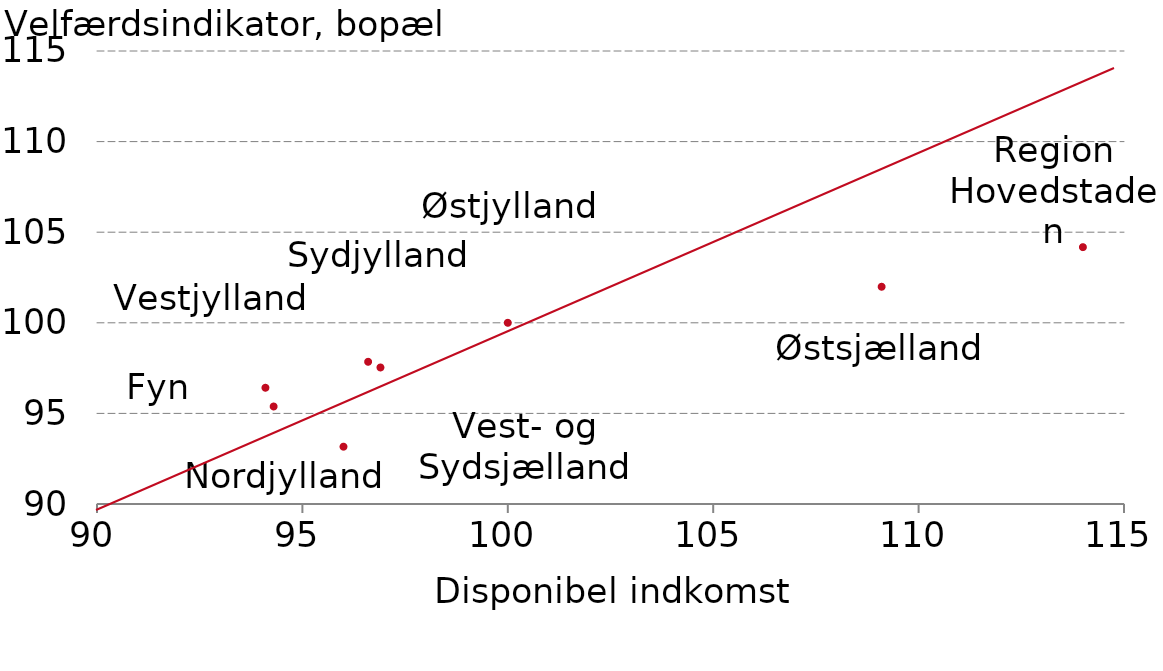
| Category |  Serie1 |
|---|---|
| 94.1 | 96.416 |
| 114.0 | 104.175 |
| 94.3 | 95.381 |
| 96.9 | 97.535 |
| 96.0 | 93.163 |
| 96.6 | 97.848 |
| 100.0 | 100 |
| 109.1 | 101.989 |